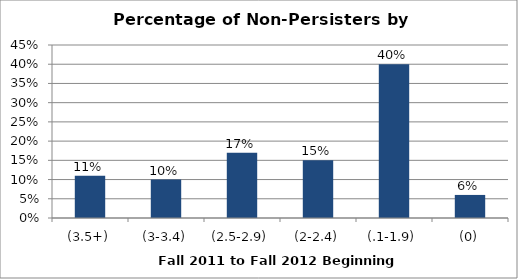
| Category | Series 0 |
|---|---|
| 0 | 0.11 |
| 1 | 0.1 |
| 2 | 0.17 |
| 3 | 0.15 |
| 4 | 0.4 |
| 5 | 0.06 |